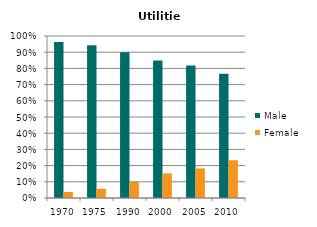
| Category | Male | Female |
|---|---|---|
| 1970.0 | 0.963 | 0.037 |
| 1975.0 | 0.943 | 0.057 |
| 1990.0 | 0.9 | 0.1 |
| 2000.0 | 0.848 | 0.152 |
| 2005.0 | 0.817 | 0.183 |
| 2010.0 | 0.767 | 0.233 |